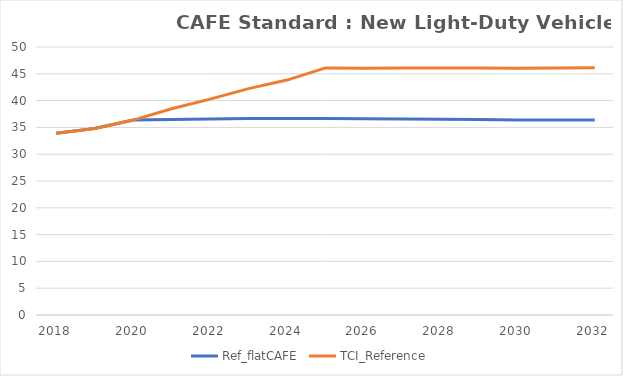
| Category | Ref_flatCAFE | TCI_Reference |
|---|---|---|
| 2018.0 | 33.916 | 33.918 |
| 2019.0 | 34.813 | 34.813 |
| 2020.0 | 36.367 | 36.367 |
| 2021.0 | 36.495 | 38.467 |
| 2022.0 | 36.586 | 40.27 |
| 2023.0 | 36.643 | 42.229 |
| 2024.0 | 36.657 | 43.827 |
| 2025.0 | 36.662 | 46.095 |
| 2026.0 | 36.628 | 46.057 |
| 2027.0 | 36.582 | 46.065 |
| 2028.0 | 36.528 | 46.069 |
| 2029.0 | 36.465 | 46.06 |
| 2030.0 | 36.396 | 46.044 |
| 2031.0 | 36.363 | 46.063 |
| 2032.0 | 36.373 | 46.127 |